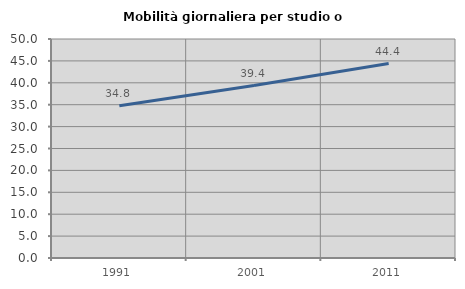
| Category | Mobilità giornaliera per studio o lavoro |
|---|---|
| 1991.0 | 34.761 |
| 2001.0 | 39.375 |
| 2011.0 | 44.4 |